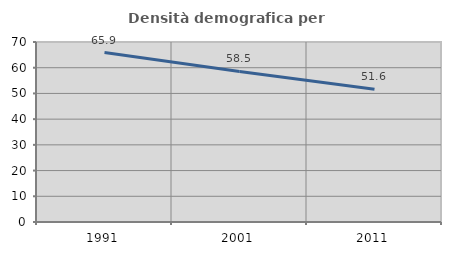
| Category | Densità demografica |
|---|---|
| 1991.0 | 65.877 |
| 2001.0 | 58.536 |
| 2011.0 | 51.635 |